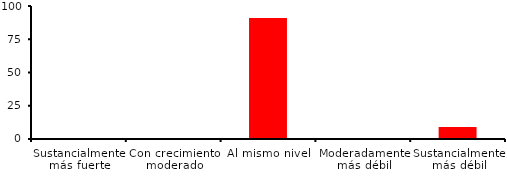
| Category | Series 0 |
|---|---|
| Sustancialmente más fuerte | 0 |
| Con crecimiento moderado | 0 |
| Al mismo nivel | 90.909 |
| Moderadamente más débil | 0 |
| Sustancialmente más débil | 9.091 |